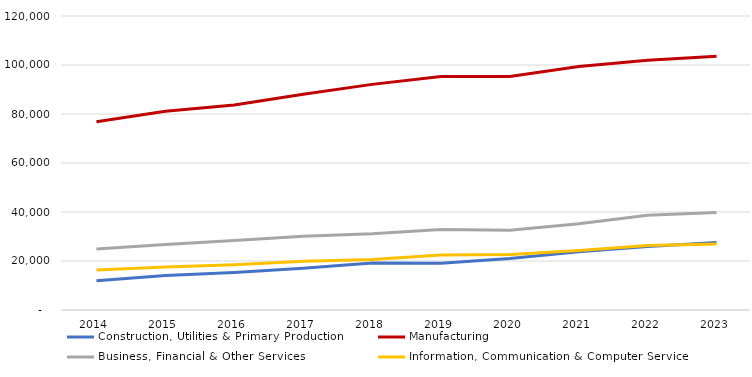
| Category | Construction, Utilities & Primary Production  | Manufacturing  | Business, Financial & Other Services | Information, Communication & Computer Services |
|---|---|---|---|---|
| 2014 | 11966 | 76872 | 24909 | 16302 |
| 2015 | 14049 | 81115 | 26770 | 17541 |
| 2016 | 15303 | 83635 | 28401 | 18452 |
| 2017 | 16998 | 88039 | 30060 | 19913 |
| 2018 | 19164 | 92092 | 31124 | 20649 |
| 2019 | 19123 | 95291 | 32880 | 22472 |
| 2020 | 21045 | 95341 | 32595 | 22656 |
| 2021 | 23731 | 99418 | 35212 | 24258 |
| 2022 | 25945 | 101908 | 38642 | 26366 |
| 2023 | 27546 | 103620 | 39762 | 26921 |